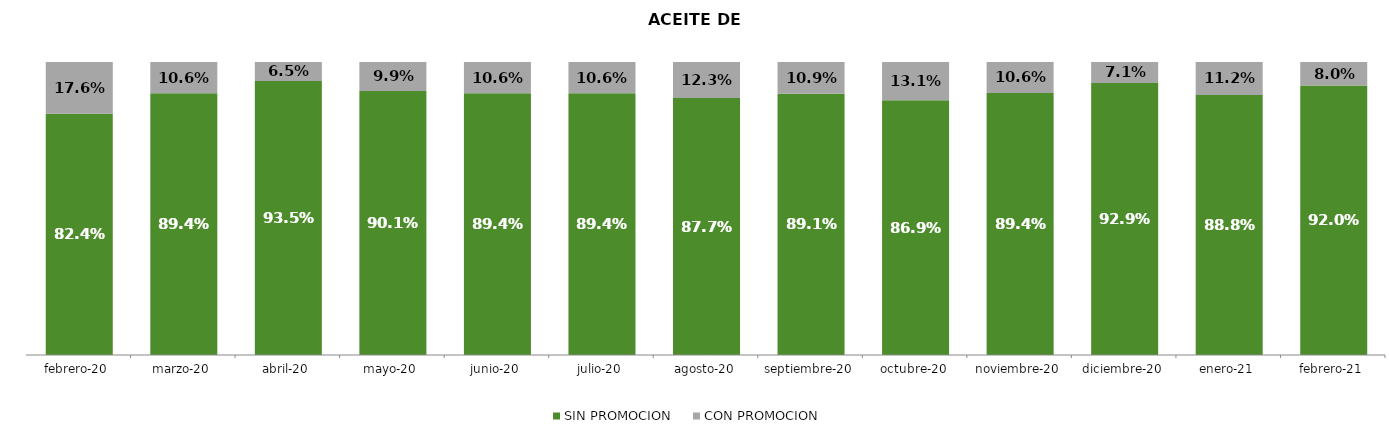
| Category | SIN PROMOCION   | CON PROMOCION   |
|---|---|---|
| 2020-02-01 | 0.824 | 0.176 |
| 2020-03-01 | 0.894 | 0.106 |
| 2020-04-01 | 0.935 | 0.065 |
| 2020-05-01 | 0.901 | 0.099 |
| 2020-06-01 | 0.894 | 0.106 |
| 2020-07-01 | 0.894 | 0.106 |
| 2020-08-01 | 0.877 | 0.123 |
| 2020-09-01 | 0.891 | 0.109 |
| 2020-10-01 | 0.869 | 0.131 |
| 2020-11-01 | 0.894 | 0.106 |
| 2020-12-01 | 0.929 | 0.071 |
| 2021-01-01 | 0.888 | 0.112 |
| 2021-02-01 | 0.92 | 0.08 |